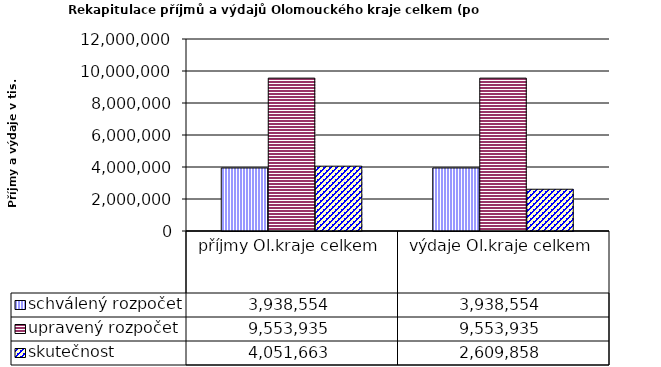
| Category | schválený rozpočet | upravený rozpočet | skutečnost |
|---|---|---|---|
| příjmy Ol.kraje celkem | 3938554 | 9553935 | 4051663 |
| výdaje Ol.kraje celkem | 3938554 | 9553935 | 2609858 |